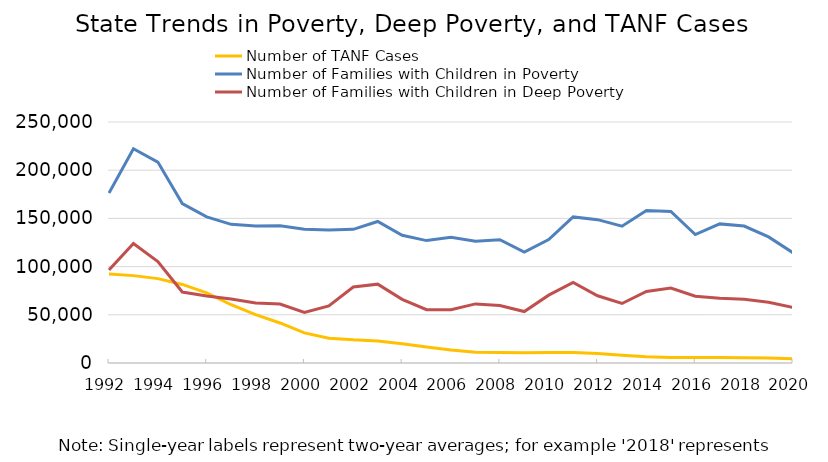
| Category | Number of TANF Cases | Number of Families with Children in Poverty | Number of Families with Children in Deep Poverty |
|---|---|---|---|
| 1992.0 | 92257.667 | 176229.5 | 96548.5 |
| 1993.0 | 90638.417 | 222239 | 124039 |
| 1994.0 | 87521.375 | 208395.5 | 105288 |
| 1995.0 | 81500.417 | 165391.5 | 73591.5 |
| 1996.0 | 72746.667 | 151647 | 69531.5 |
| 1997.0 | 60430.792 | 143858.5 | 66286.5 |
| 1998.0 | 50094.583 | 142031 | 62207 |
| 1999.0 | 41528.667 | 142343 | 61098 |
| 2000.0 | 31205.833 | 138774 | 52523 |
| 2001.0 | 25751.833 | 137974 | 59263 |
| 2002.0 | 24038.417 | 138684.5 | 78782.5 |
| 2003.0 | 22924.75 | 146789 | 81807 |
| 2004.0 | 20013.708 | 132551 | 66026 |
| 2005.0 | 16506.958 | 126972 | 55307 |
| 2006.0 | 13376.333 | 130529 | 55358 |
| 2007.0 | 11274.125 | 126197 | 61315 |
| 2008.0 | 10955.542 | 127901 | 59569 |
| 2009.0 | 10706.917 | 115051.5 | 53354.5 |
| 2010.0 | 10899.292 | 128072 | 70385.5 |
| 2011.0 | 10897.042 | 151522.5 | 83604.5 |
| 2012.0 | 9957.917 | 148702 | 69753.5 |
| 2013.0 | 8149.958 | 141898.5 | 61739 |
| 2014.0 | 6465.875 | 158274.5 | 74222 |
| 2015.0 | 5629 | 157241.5 | 77825.5 |
| 2016.0 | 5636.042 | 133263 | 69202.5 |
| 2017.0 | 5669 | 144305.5 | 67100.5 |
| 2018.0 | 5533.625 | 142054 | 66106 |
| 2019.0 | 5090.333 | 130769 | 63099 |
| 2020.0 | 4355.5 | 114302 | 57674.5 |